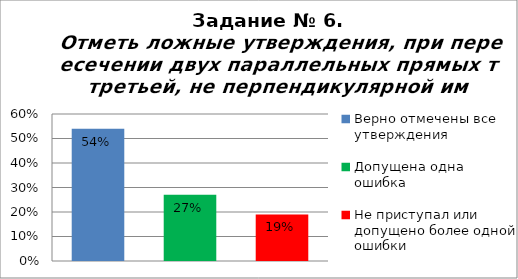
| Category | Отметь ложные утверждения, при пересечении двух параллельных прямых третьей, не перпендикулярной им. |
|---|---|
| Верно отмечены все утверждения | 0.54 |
| Допущена одна ошибка | 0.27 |
| Не приступал или допущено более одной ошибки | 0.19 |